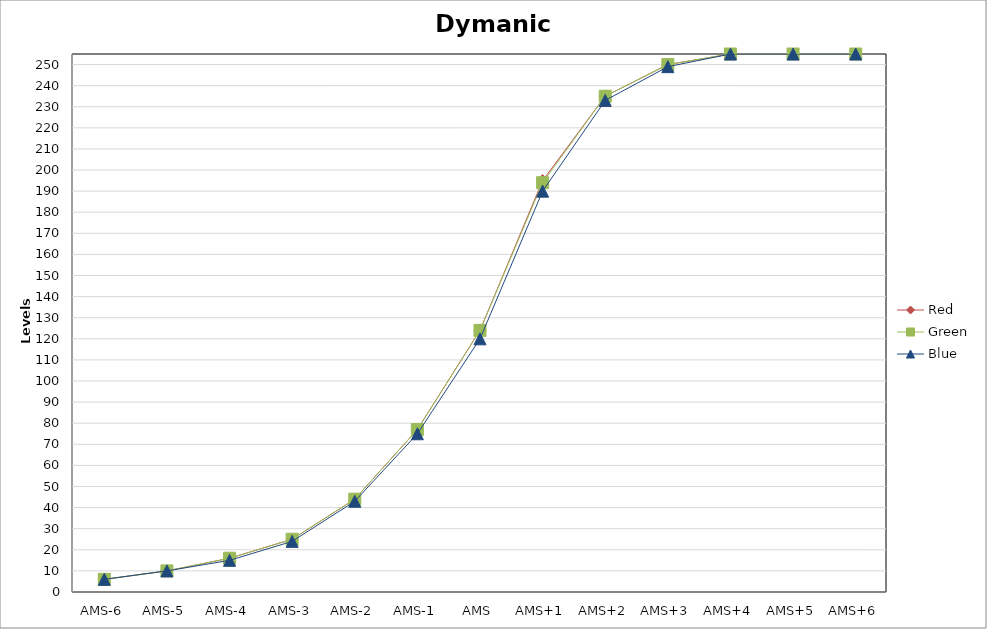
| Category | Red | Green | Blue |
|---|---|---|---|
| AMS-6 | 6 | 6 | 6 |
| AMS-5 | 10 | 10 | 10 |
| AMS-4 | 16 | 16 | 15 |
| AMS-3 | 25 | 25 | 24 |
| AMS-2 | 44 | 44 | 43 |
| AMS-1 | 77 | 77 | 75 |
| AMS | 124 | 124 | 120 |
| AMS+1 | 195 | 194 | 190 |
| AMS+2 | 235 | 235 | 233 |
| AMS+3 | 250 | 250 | 249 |
| AMS+4 | 255 | 255 | 255 |
| AMS+5 | 255 | 255 | 255 |
| AMS+6 | 255 | 255 | 255 |